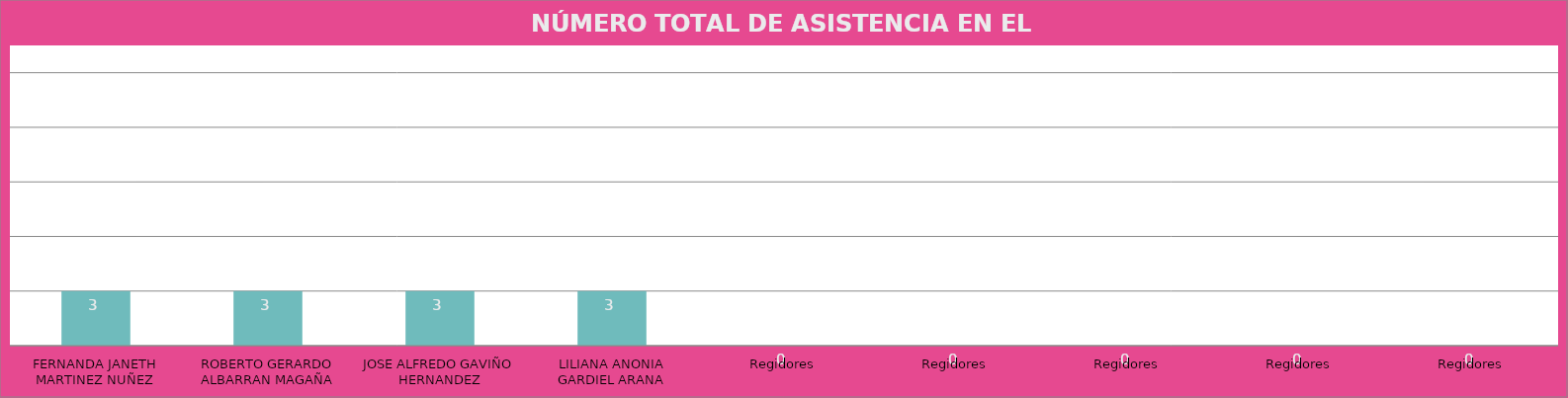
| Category | FERNANDA JANETH MARTINEZ NUÑEZ |
|---|---|
| FERNANDA JANETH MARTINEZ NUÑEZ | 3 |
| ROBERTO GERARDO ALBARRAN MAGAÑA | 3 |
| JOSE ALFREDO GAVIÑO HERNANDEZ | 3 |
| LILIANA ANONIA GARDIEL ARANA | 3 |
| Regidores | 0 |
| Regidores | 0 |
| Regidores | 0 |
| Regidores | 0 |
| Regidores | 0 |